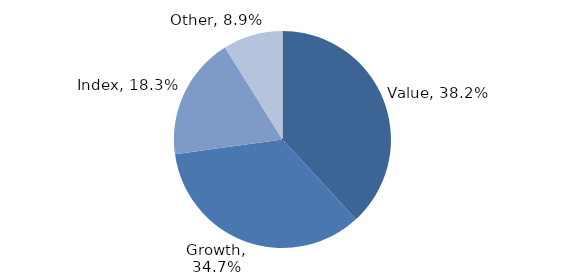
| Category | Investment Style |
|---|---|
| Value | 0.382 |
| Growth | 0.347 |
| Index | 0.183 |
| Other | 0.089 |